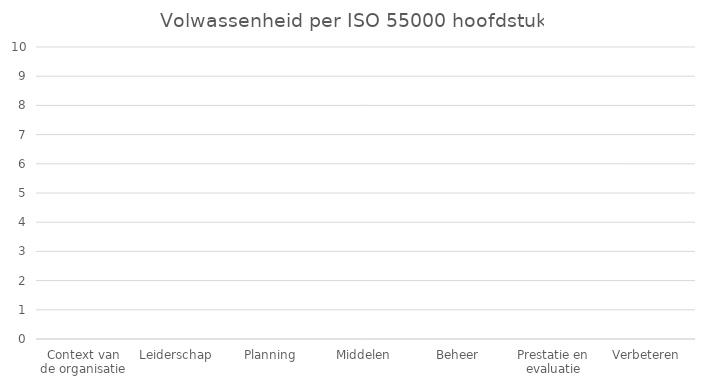
| Category | Series 1 |
|---|---|
| Context van de organisatie | 0 |
| Leiderschap | 0 |
| Planning | 0 |
| Middelen | 0 |
| Beheer | 0 |
| Prestatie en evaluatie | 0 |
| Verbeteren | 0 |